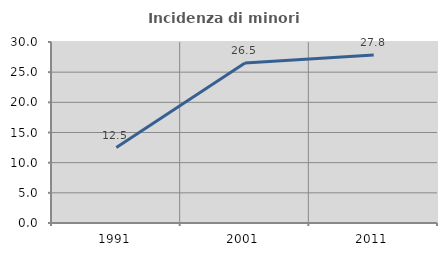
| Category | Incidenza di minori stranieri |
|---|---|
| 1991.0 | 12.5 |
| 2001.0 | 26.519 |
| 2011.0 | 27.842 |